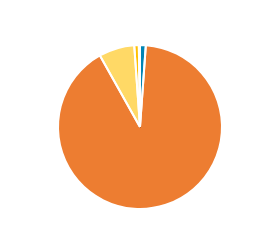
| Category | Series 0 |
|---|---|
| PC/MC | 370 |
| CAR/LGV | 29616 |
| OGV1 & PSV 2Axle | 2290 |
| OGV1 & PSV 3 Axle | 292 |
| OGV2 | 75 |